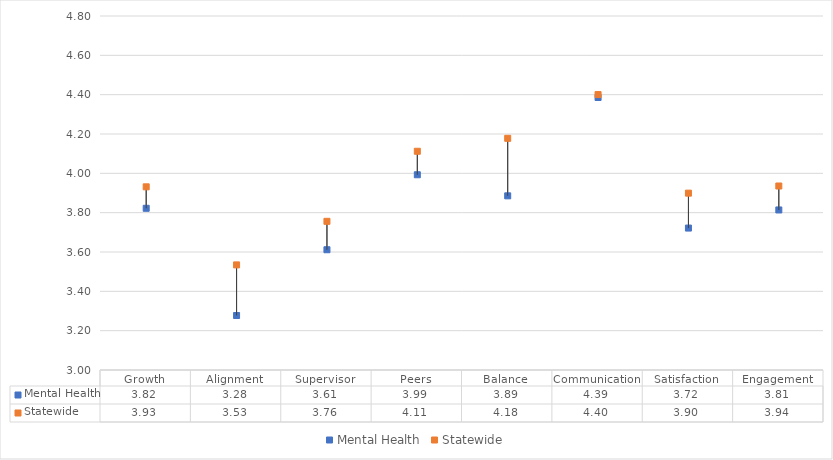
| Category | Mental Health | Statewide |
|---|---|---|
| Growth | 3.822 | 3.931 |
| Alignment | 3.277 | 3.534 |
| Supervisor | 3.611 | 3.756 |
| Peers | 3.993 | 4.112 |
| Balance | 3.886 | 4.178 |
| Communication | 4.386 | 4.4 |
| Satisfaction | 3.722 | 3.899 |
| Engagement | 3.814 | 3.936 |